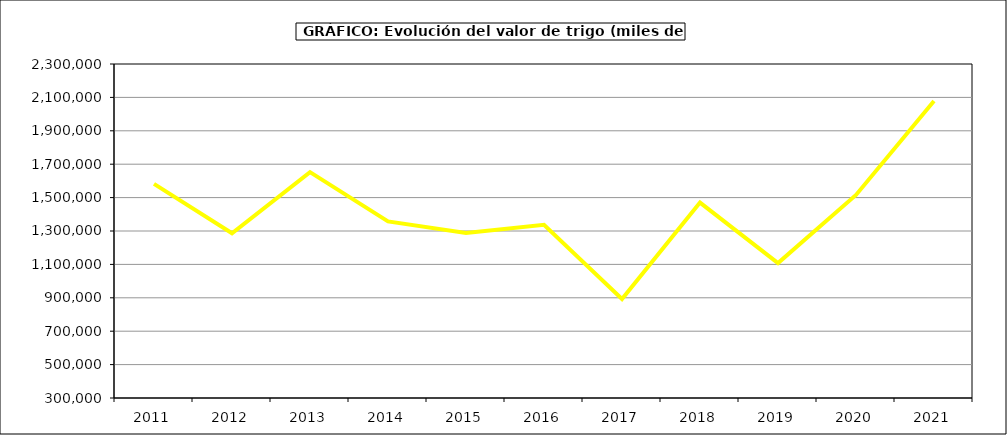
| Category | Valor |
|---|---|
| 2011.0 | 1582317.395 |
| 2012.0 | 1286558.361 |
| 2013.0 | 1652767.635 |
| 2014.0 | 1357332.32 |
| 2015.0 | 1287809 |
| 2016.0 | 1336858 |
| 2017.0 | 893127.676 |
| 2018.0 | 1470167.37 |
| 2019.0 | 1108130.614 |
| 2020.0 | 1515727.934 |
| 2021.0 | 2078875.429 |